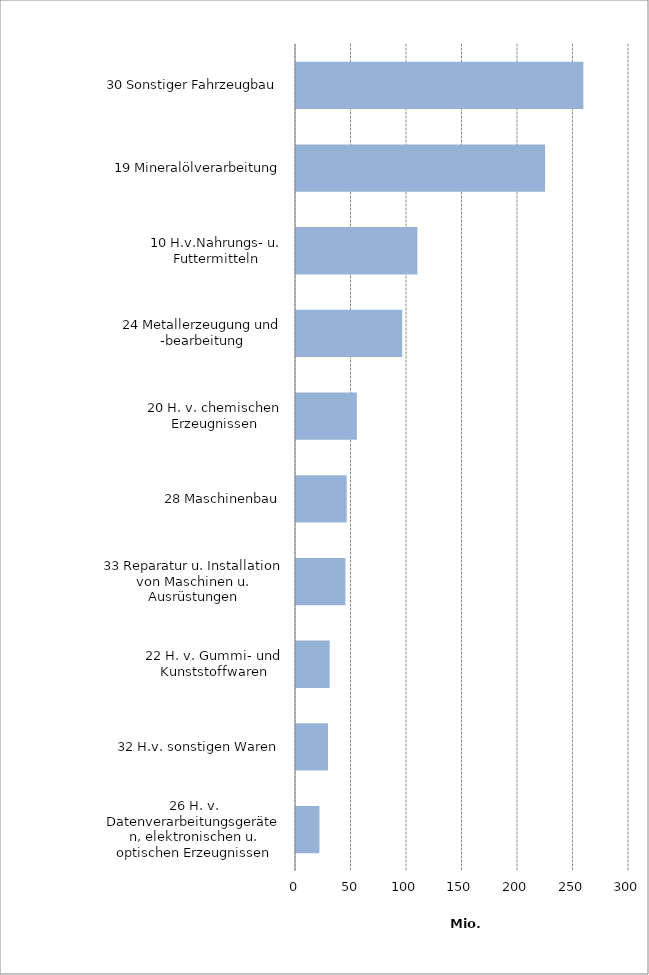
| Category | Series 0 |
|---|---|
| 26 H. v. Datenverarbeitungsgeräten, elektronischen u. optischen Erzeugnissen | 21.123 |
| 32 H.v. sonstigen Waren | 28.863 |
| 22 H. v. Gummi- und Kunststoffwaren | 30.36 |
| 33 Reparatur u. Installation von Maschinen u. Ausrüstungen | 44.521 |
| 28 Maschinenbau | 45.661 |
| 20 H. v. chemischen Erzeugnissen | 54.836 |
| 24 Metallerzeugung und -bearbeitung | 95.655 |
| 10 H.v.Nahrungs- u. Futtermitteln | 109.35 |
| 19 Mineralölverarbeitung | 224.403 |
| 30 Sonstiger Fahrzeugbau | 258.875 |